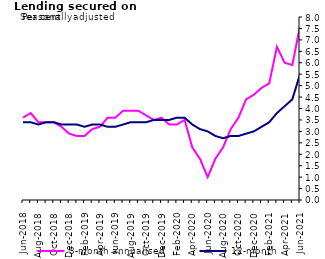
| Category | 3-month annualised | 12-month |
|---|---|---|
| Jun-2018 | 3.6 | 3.4 |
| Jul-2018 | 3.8 | 3.4 |
| Aug-2018 | 3.4 | 3.3 |
| Sep-2018 | 3.4 | 3.4 |
| Oct-2018 | 3.4 | 3.4 |
| Nov-2018 | 3.2 | 3.3 |
| Dec-2018 | 2.9 | 3.3 |
| Jan-2019 | 2.8 | 3.3 |
| Feb-2019 | 2.8 | 3.2 |
| Mar-2019 | 3.1 | 3.3 |
| Apr-2019 | 3.2 | 3.3 |
| May-2019 | 3.6 | 3.2 |
| Jun-2019 | 3.6 | 3.2 |
| Jul-2019 | 3.9 | 3.3 |
| Aug-2019 | 3.9 | 3.4 |
| Sep-2019 | 3.9 | 3.4 |
| Oct-2019 | 3.7 | 3.4 |
| Nov-2019 | 3.5 | 3.5 |
| Dec-2019 | 3.6 | 3.5 |
| Jan-2020 | 3.3 | 3.5 |
| Feb-2020 | 3.3 | 3.6 |
| Mar-2020 | 3.5 | 3.6 |
| Apr-2020 | 2.3 | 3.3 |
| May-2020 | 1.8 | 3.1 |
| Jun-2020 | 1 | 3 |
| Jul-2020 | 1.8 | 2.8 |
| Aug-2020 | 2.3 | 2.7 |
| Sep-2020 | 3.1 | 2.8 |
| Oct-2020 | 3.6 | 2.8 |
| Nov-2020 | 4.4 | 2.9 |
| Dec-2020 | 4.6 | 3 |
| Jan-2021 | 4.9 | 3.2 |
| Feb-2021 | 5.1 | 3.4 |
| Mar-2021 | 6.7 | 3.8 |
| Apr-2021 | 6 | 4.1 |
| May-2021 | 5.9 | 4.4 |
| Jun-2021 | 7.6 | 5.5 |